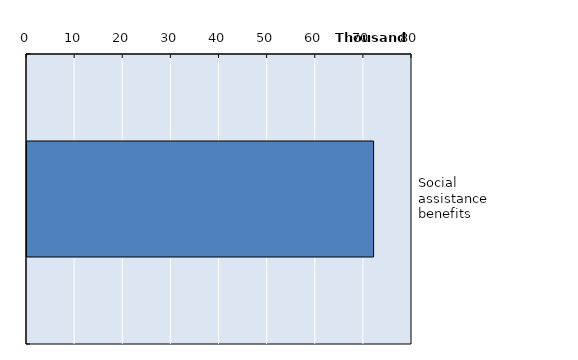
| Category | Series 0 |
|---|---|
| Social assistance benefits | 72024.417 |